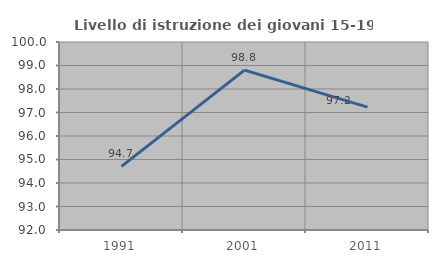
| Category | Livello di istruzione dei giovani 15-19 anni |
|---|---|
| 1991.0 | 94.705 |
| 2001.0 | 98.802 |
| 2011.0 | 97.231 |